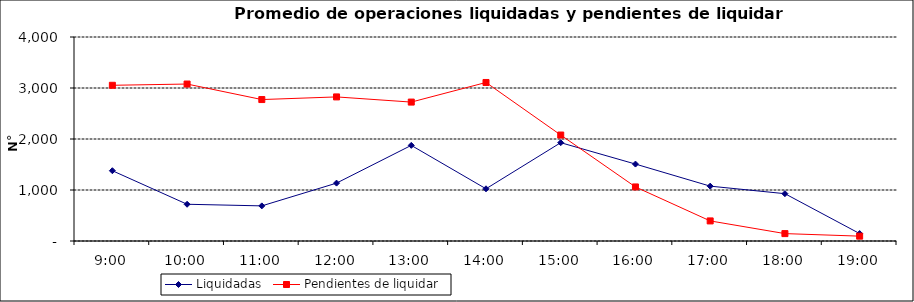
| Category | Liquidadas | Pendientes de liquidar |
|---|---|---|
| 0.375 | 1378.3 | 3053.1 |
| 0.4166666666666667 | 720.5 | 3077.8 |
| 0.4583333333333333 | 688.65 | 2773.4 |
| 0.5 | 1134.95 | 2825.15 |
| 0.5416666666666666 | 1875.2 | 2723.75 |
| 0.5833333333333334 | 1023.75 | 3108.15 |
| 0.625 | 1927.75 | 2077.7 |
| 0.6666666666666666 | 1508.3 | 1060 |
| 0.7083333333333334 | 1075.45 | 393.7 |
| 0.75 | 927.7 | 145.15 |
| 0.7916666666666666 | 145.7 | 95.2 |